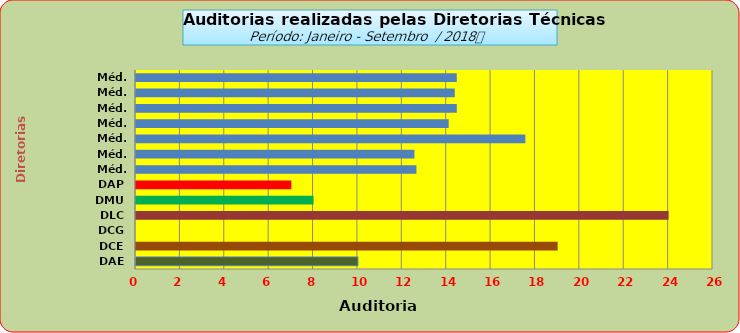
| Category | Series 0 |
|---|---|
| DAE | 10 |
| DCE | 19 |
| DCG | 0 |
| DLC | 24 |
| DMU | 8 |
| DAP | 7 |
| Méd. 2011 | 12.636 |
| Méd. 2012 | 12.545 |
| Méd. 2013 | 17.545 |
| Méd. 2014 | 14.091 |
| Méd. 2015 | 14.455 |
| Méd. 2016 | 14.364 |
| Méd. 2017 | 14.455 |